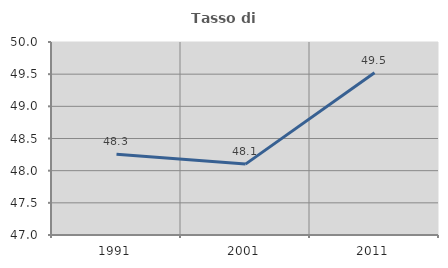
| Category | Tasso di occupazione   |
|---|---|
| 1991.0 | 48.254 |
| 2001.0 | 48.102 |
| 2011.0 | 49.522 |